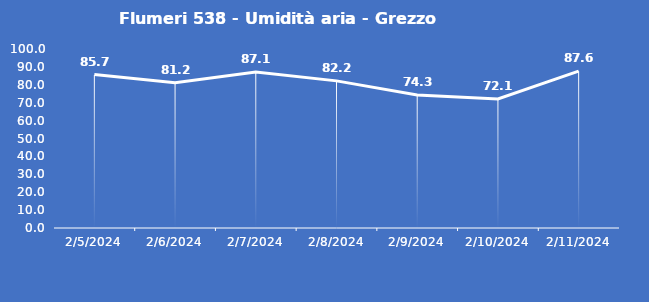
| Category | Flumeri 538 - Umidità aria - Grezzo (%) |
|---|---|
| 2/5/24 | 85.7 |
| 2/6/24 | 81.2 |
| 2/7/24 | 87.1 |
| 2/8/24 | 82.2 |
| 2/9/24 | 74.3 |
| 2/10/24 | 72.1 |
| 2/11/24 | 87.6 |